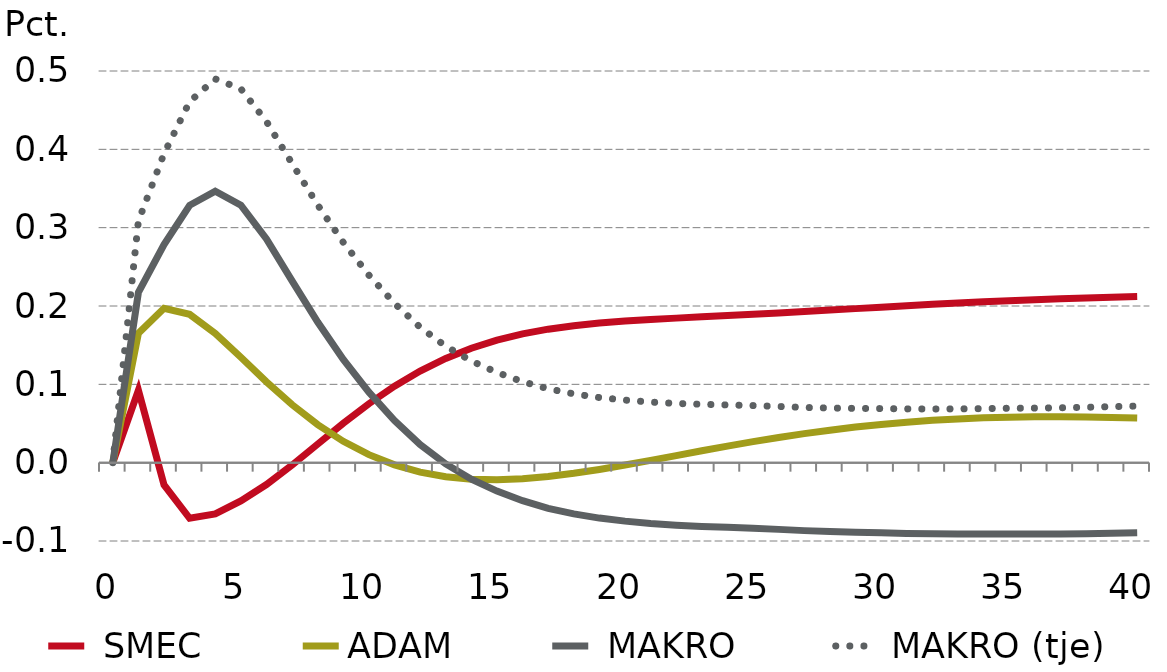
| Category |  SMEC | ADAM |  MAKRO |  MAKRO (tje) |
|---|---|---|---|---|
| 0.0 | 0 | 0 | 0 | 0 |
| nan | 0.092 | 0.165 | 0.217 | 0.309 |
| nan | -0.028 | 0.197 | 0.278 | 0.395 |
| nan | -0.071 | 0.189 | 0.329 | 0.461 |
| nan | -0.066 | 0.165 | 0.347 | 0.49 |
| 5.0 | -0.049 | 0.135 | 0.329 | 0.477 |
| nan | -0.028 | 0.103 | 0.286 | 0.436 |
| nan | -0.003 | 0.074 | 0.232 | 0.382 |
| nan | 0.024 | 0.049 | 0.179 | 0.329 |
| nan | 0.05 | 0.027 | 0.132 | 0.281 |
| 10.0 | 0.075 | 0.01 | 0.09 | 0.239 |
| nan | 0.098 | -0.003 | 0.054 | 0.203 |
| nan | 0.117 | -0.012 | 0.023 | 0.173 |
| nan | 0.133 | -0.018 | -0.002 | 0.149 |
| nan | 0.146 | -0.021 | -0.021 | 0.13 |
| 15.0 | 0.156 | -0.022 | -0.036 | 0.115 |
| nan | 0.164 | -0.021 | -0.049 | 0.103 |
| nan | 0.17 | -0.018 | -0.058 | 0.094 |
| nan | 0.175 | -0.014 | -0.065 | 0.088 |
| nan | 0.178 | -0.009 | -0.071 | 0.083 |
| 20.0 | 0.181 | -0.003 | -0.075 | 0.08 |
| nan | 0.183 | 0.003 | -0.078 | 0.077 |
| nan | 0.185 | 0.009 | -0.08 | 0.076 |
| nan | 0.186 | 0.015 | -0.081 | 0.075 |
| nan | 0.188 | 0.021 | -0.083 | 0.074 |
| 25.0 | 0.189 | 0.027 | -0.084 | 0.073 |
| nan | 0.191 | 0.032 | -0.085 | 0.072 |
| nan | 0.193 | 0.037 | -0.087 | 0.07 |
| nan | 0.195 | 0.042 | -0.088 | 0.07 |
| nan | 0.197 | 0.045 | -0.089 | 0.069 |
| 30.0 | 0.199 | 0.049 | -0.089 | 0.069 |
| nan | 0.2 | 0.052 | -0.09 | 0.069 |
| nan | 0.202 | 0.054 | -0.091 | 0.069 |
| nan | 0.204 | 0.056 | -0.091 | 0.069 |
| nan | 0.205 | 0.057 | -0.091 | 0.069 |
| 35.0 | 0.207 | 0.058 | -0.091 | 0.069 |
| nan | 0.208 | 0.059 | -0.091 | 0.07 |
| nan | 0.209 | 0.059 | -0.091 | 0.07 |
| nan | 0.21 | 0.058 | -0.091 | 0.071 |
| nan | 0.211 | 0.058 | -0.09 | 0.072 |
| 40.0 | 0.212 | 0.057 | -0.089 | 0.072 |